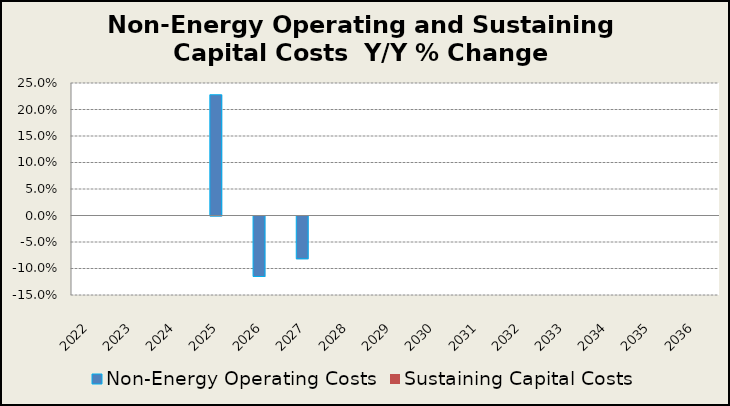
| Category | Non-Energy Operating Costs  | Sustaining Capital Costs |
|---|---|---|
| 2022.0 | 0 | 0 |
| 2023.0 | 0 | 0 |
| 2024.0 | 0 | 0 |
| 2025.0 | 0.228 | 0 |
| 2026.0 | -0.114 | 0 |
| 2027.0 | -0.081 | 0 |
| 2028.0 | 0 | 0 |
| 2029.0 | 0 | 0 |
| 2030.0 | 0 | 0 |
| 2031.0 | 0 | 0 |
| 2032.0 | 0 | 0 |
| 2033.0 | 0 | 0 |
| 2034.0 | 0 | 0 |
| 2035.0 | 0 | 0 |
| 2036.0 | 0 | 0 |